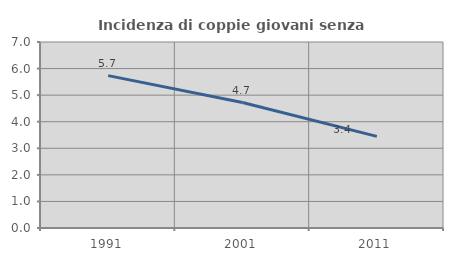
| Category | Incidenza di coppie giovani senza figli |
|---|---|
| 1991.0 | 5.734 |
| 2001.0 | 4.721 |
| 2011.0 | 3.448 |